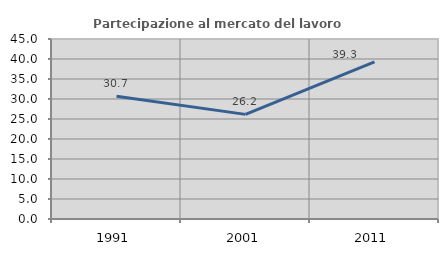
| Category | Partecipazione al mercato del lavoro  femminile |
|---|---|
| 1991.0 | 30.667 |
| 2001.0 | 26.154 |
| 2011.0 | 39.286 |